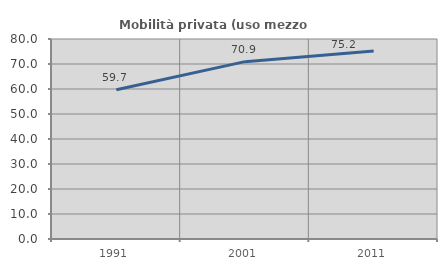
| Category | Mobilità privata (uso mezzo privato) |
|---|---|
| 1991.0 | 59.715 |
| 2001.0 | 70.943 |
| 2011.0 | 75.179 |